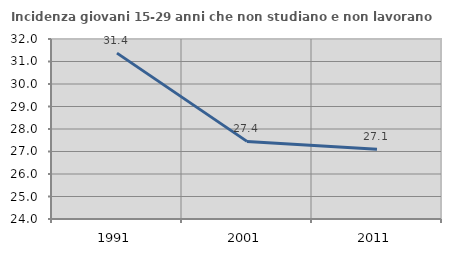
| Category | Incidenza giovani 15-29 anni che non studiano e non lavorano  |
|---|---|
| 1991.0 | 31.373 |
| 2001.0 | 27.45 |
| 2011.0 | 27.102 |